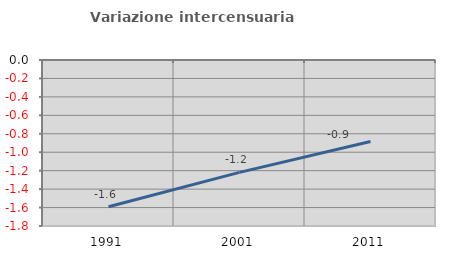
| Category | Variazione intercensuaria annua |
|---|---|
| 1991.0 | -1.59 |
| 2001.0 | -1.219 |
| 2011.0 | -0.884 |